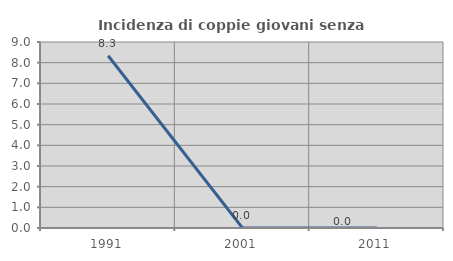
| Category | Incidenza di coppie giovani senza figli |
|---|---|
| 1991.0 | 8.333 |
| 2001.0 | 0 |
| 2011.0 | 0 |